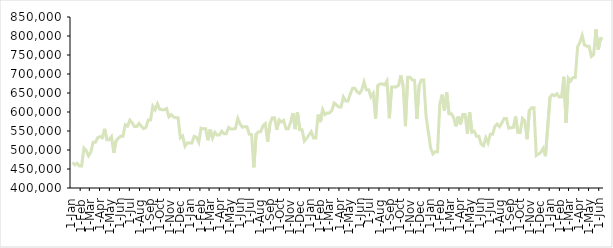
| Category | Number of new videos |
|---|---|
| 2017-01-08 | 467396 |
| 2017-01-15 | 460865 |
| 2017-01-22 | 465297 |
| 2017-01-29 | 458172 |
| 2017-02-05 | 458172 |
| 2017-02-12 | 504926 |
| 2017-02-19 | 498528 |
| 2017-02-26 | 484548 |
| 2017-03-05 | 493884 |
| 2017-03-12 | 520471 |
| 2017-03-19 | 520471 |
| 2017-03-26 | 532642 |
| 2017-04-02 | 535457 |
| 2017-04-09 | 532258 |
| 2017-04-16 | 555764 |
| 2017-04-23 | 527028 |
| 2017-04-30 | 527028 |
| 2017-05-07 | 535377 |
| 2017-05-14 | 492452 |
| 2017-05-21 | 524233 |
| 2017-05-28 | 531289 |
| 2017-06-04 | 536117 |
| 2017-06-11 | 536117 |
| 2017-06-18 | 566494 |
| 2017-06-25 | 562764 |
| 2017-07-02 | 578477 |
| 2017-07-09 | 571833 |
| 2017-07-16 | 561717 |
| 2017-07-23 | 561717 |
| 2017-07-30 | 569891 |
| 2017-08-06 | 562328 |
| 2017-08-13 | 556335 |
| 2017-08-20 | 559633 |
| 2017-08-27 | 579125 |
| 2017-09-03 | 579125 |
| 2017-09-10 | 615332 |
| 2017-09-17 | 605845 |
| 2017-09-24 | 621335 |
| 2017-10-01 | 607231 |
| 2017-10-08 | 605845 |
| 2017-10-15 | 605845 |
| 2017-10-22 | 609091 |
| 2017-10-29 | 587485 |
| 2017-11-05 | 592945 |
| 2017-11-12 | 587193 |
| 2017-11-19 | 584668 |
| 2017-11-26 | 584668 |
| 2017-12-03 | 532074 |
| 2017-12-10 | 536697 |
| 2017-12-17 | 510138 |
| 2017-12-24 | 518465 |
| 2018-01-07 | 518465 |
| 2018-01-14 | 536084 |
| 2018-01-21 | 533399 |
| 2018-01-28 | 520373 |
| 2018-02-04 | 557489 |
| 2018-02-11 | 555914 |
| 2018-02-18 | 555914 |
| 2018-02-25 | 525713 |
| 2018-03-04 | 554033 |
| 2018-03-11 | 531373 |
| 2018-03-18 | 546514 |
| 2018-03-25 | 539257 |
| 2018-04-01 | 539257 |
| 2018-04-08 | 549697 |
| 2018-04-15 | 542937 |
| 2018-04-22 | 542852 |
| 2018-04-29 | 559235 |
| 2018-05-06 | 555397 |
| 2018-05-13 | 555397 |
| 2018-05-20 | 556558 |
| 2018-05-27 | 582938 |
| 2018-06-03 | 568484 |
| 2018-06-10 | 559934 |
| 2018-06-17 | 561319 |
| 2018-06-24 | 561319 |
| 2018-07-01 | 541576 |
| 2018-07-08 | 540599 |
| 2018-07-15 | 454417 |
| 2018-07-22 | 541576 |
| 2018-07-29 | 547738 |
| 2018-08-05 | 547738 |
| 2018-08-12 | 563944 |
| 2018-08-19 | 569524 |
| 2018-08-26 | 521242 |
| 2018-09-02 | 568589 |
| 2018-09-09 | 584602 |
| 2018-09-16 | 584602 |
| 2018-09-23 | 553248 |
| 2018-09-30 | 579123 |
| 2018-10-07 | 573453 |
| 2018-10-14 | 577865 |
| 2018-10-21 | 555943 |
| 2018-10-28 | 555943 |
| 2018-11-04 | 573211 |
| 2018-11-11 | 597114 |
| 2018-11-18 | 554964 |
| 2018-11-25 | 599534 |
| 2018-12-02 | 553411 |
| 2018-12-09 | 553411 |
| 2018-12-16 | 523689 |
| 2018-12-23 | 530861 |
| 2019-01-06 | 548067 |
| 2019-01-13 | 531660 |
| 2019-01-20 | 531660 |
| 2019-01-27 | 593102 |
| 2019-02-03 | 573426 |
| 2019-02-10 | 606227 |
| 2019-02-17 | 593220 |
| 2019-02-24 | 597516 |
| 2019-03-03 | 597516 |
| 2019-03-10 | 604581 |
| 2019-03-17 | 623633 |
| 2019-03-24 | 618619 |
| 2019-03-31 | 613349 |
| 2019-04-07 | 613349 |
| 2019-04-14 | 639657 |
| 2019-04-21 | 629176 |
| 2019-04-28 | 629074 |
| 2019-05-05 | 647299 |
| 2019-05-12 | 662243 |
| 2019-05-19 | 662243 |
| 2019-05-26 | 652975 |
| 2019-06-02 | 648834 |
| 2019-06-09 | 658069 |
| 2019-06-16 | 679029 |
| 2019-06-23 | 658472 |
| 2019-06-30 | 658472 |
| 2019-07-07 | 639686 |
| 2019-07-14 | 648906 |
| 2019-07-21 | 581961 |
| 2019-07-28 | 669879 |
| 2019-08-04 | 673981 |
| 2019-08-11 | 673981 |
| 2019-08-18 | 671433 |
| 2019-08-25 | 681760 |
| 2019-09-01 | 583704 |
| 2019-09-08 | 665605 |
| 2019-09-15 | 666016 |
| 2019-09-22 | 666016 |
| 2019-09-29 | 670145 |
| 2019-10-06 | 695969 |
| 2019-10-13 | 668738 |
| 2019-10-20 | 562918 |
| 2019-10-27 | 691506 |
| 2019-11-03 | 691506 |
| 2019-11-10 | 684534 |
| 2019-11-17 | 683377 |
| 2019-11-24 | 581992 |
| 2019-12-01 | 671203 |
| 2019-12-08 | 684402 |
| 2019-12-15 | 684402 |
| 2019-12-22 | 588677 |
| 2020-01-05 | 505176 |
| 2020-01-12 | 489774 |
| 2020-01-19 | 495552 |
| 2020-01-26 | 495552 |
| 2020-02-02 | 620033 |
| 2020-02-09 | 645714 |
| 2020-02-16 | 603096 |
| 2020-02-23 | 651585 |
| 2020-03-01 | 595707 |
| 2020-03-08 | 595707 |
| 2020-03-15 | 585589 |
| 2020-03-22 | 562404 |
| 2020-03-29 | 587992 |
| 2020-04-05 | 567631 |
| 2020-04-12 | 593471 |
| 2020-04-19 | 593471 |
| 2020-04-26 | 542901 |
| 2020-05-03 | 599948 |
| 2020-05-10 | 546396 |
| 2020-05-17 | 549118 |
| 2020-05-24 | 536226 |
| 2020-05-31 | 536226 |
| 2020-06-07 | 515693 |
| 2020-06-14 | 511327 |
| 2020-06-21 | 532212 |
| 2020-06-28 | 518901 |
| 2020-07-05 | 541230 |
| 2020-07-12 | 541230 |
| 2020-07-19 | 562584 |
| 2020-07-26 | 568164 |
| 2020-08-02 | 561334 |
| 2020-08-09 | 571061 |
| 2020-08-16 | 582633 |
| 2020-08-23 | 582633 |
| 2020-08-30 | 557642 |
| 2020-09-06 | 558669 |
| 2020-09-13 | 559379 |
| 2020-09-20 | 587948 |
| 2020-09-27 | 546039 |
| 2020-10-04 | 546039 |
| 2020-10-11 | 582994 |
| 2020-10-18 | 576949 |
| 2020-10-25 | 528363 |
| 2020-11-01 | 604273 |
| 2020-11-08 | 611258 |
| 2020-11-15 | 611258 |
| 2020-11-22 | 485645 |
| 2020-11-29 | 489447 |
| 2020-12-06 | 493978 |
| 2020-12-13 | 504209 |
| 2020-12-20 | 483605 |
| 2021-01-03 | 639158 |
| 2021-01-10 | 645623 |
| 2021-01-17 | 642725 |
| 2021-01-24 | 647921 |
| 2021-01-31 | 639157 |
| 2021-02-07 | 639157 |
| 2021-02-14 | 692696 |
| 2021-02-21 | 571170 |
| 2021-02-28 | 688703 |
| 2021-03-07 | 681609 |
| 2021-03-14 | 690840 |
| 2021-03-21 | 690840 |
| 2021-03-28 | 771087 |
| 2021-04-04 | 783294 |
| 2021-04-11 | 801395 |
| 2021-04-18 | 776140 |
| 2021-04-25 | 773153 |
| 2021-05-02 | 773153 |
| 2021-05-09 | 746294 |
| 2021-05-16 | 751394 |
| 2021-05-23 | 817685 |
| 2021-05-30 | 764240 |
| 2021-06-06 | 793357 |
| 2021-06-13 | 793357 |